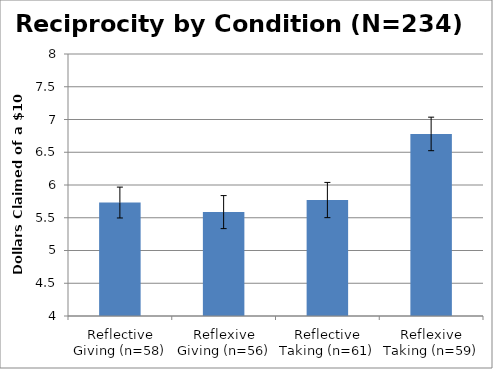
| Category | Round 2 |
|---|---|
| Reflective Giving (n=58) | 5.732 |
| Reflexive Giving (n=56) | 5.586 |
| Reflective Taking (n=61) | 5.77 |
| Reflexive Taking (n=59) | 6.78 |